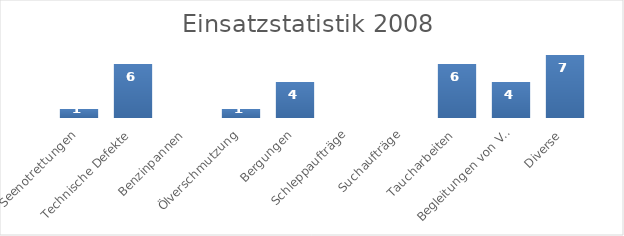
| Category | Series 0 |
|---|---|
| Seenotrettungen | 1 |
| Technische Defekte | 6 |
| Benzinpannen | 0 |
| Ölverschmutzung | 1 |
| Bergungen | 4 |
| Schleppaufträge | 0 |
| Suchaufträge | 0 |
| Taucharbeiten | 6 |
| Begleitungen von Veranstaltungen | 4 |
| Diverse | 7 |